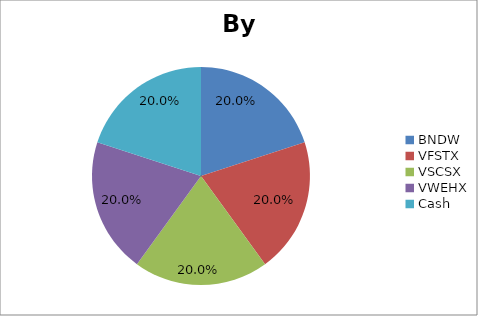
| Category | Series 0 |
|---|---|
| BNDW | 0.2 |
| VFSTX | 0.2 |
| VSCSX | 0.2 |
| VWEHX | 0.2 |
| Cash | 0.2 |